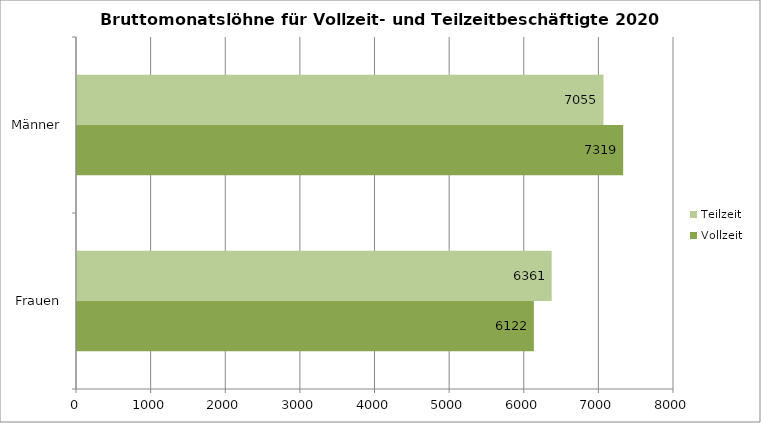
| Category | Vollzeit | Teilzeit |
|---|---|---|
| Frauen | 6122 | 6361 |
| Männer | 7319 | 7055 |